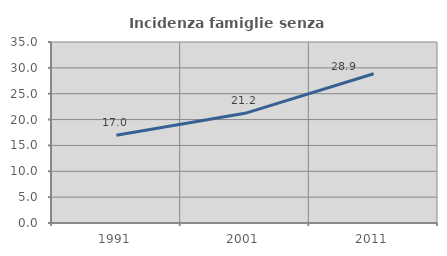
| Category | Incidenza famiglie senza nuclei |
|---|---|
| 1991.0 | 16.964 |
| 2001.0 | 21.204 |
| 2011.0 | 28.858 |